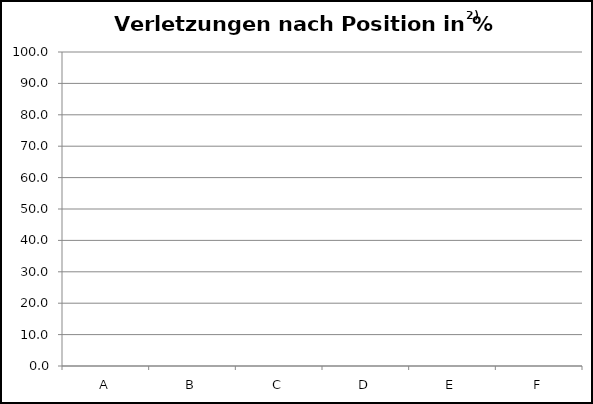
| Category | Series 0 |
|---|---|
| A | 0 |
| B | 0 |
| C | 0 |
| D | 0 |
| E | 0 |
| F | 0 |